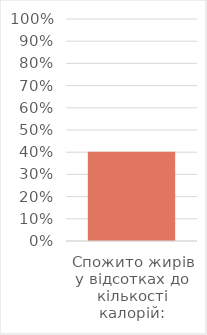
| Category | Series 0 |
|---|---|
| Спожито жирів у відсотках до кількості калорій: | 0.402 |